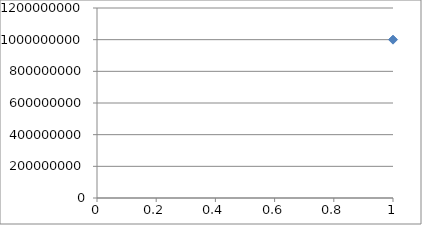
| Category | Series 0 |
|---|---|
| 0 | 1000000000 |
| 1 | 470960000 |
| 2 | 226599040 |
| 3 | 114507330.56 |
| 4 | 63995237.54 |
| 5 | 42295840.164 |
| 6 | 34243647.773 |
| 7 | 32846370.973 |
| 8 | 34911205.484 |
| 9 | 39016566.993 |
| 10 | 44572297.556 |
| 11 | 51385134.214 |
| 12 | 59458864.526 |
| 13 | 68903661.351 |
| 14 | 79896406.792 |
| 15 | 92665057.944 |
| 16 | 107484612.11 |
| 17 | 124678969.279 |
| 18 | 144626128.486 |
| 19 | 167765624.237 |
| 20 | 194607806.365 |
| 21 | 225744907.947 |
| 22 | 261864024.808 |
| 23 | 303762237.035 |
| 24 | 352364180.233 |
| 25 | 408742442.236 |
| 26 | 474141229.822 |
| 27 | 550003825.123 |
| 28 | 638004436.46 |
| 29 | 740085145.976 |
| 30 | 858498769.186 |
| 31 | 995858572.187 |